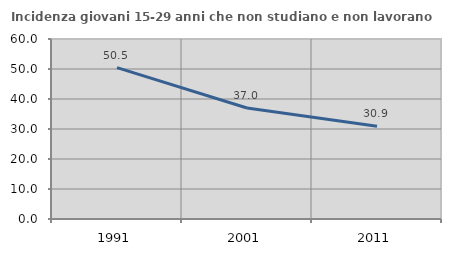
| Category | Incidenza giovani 15-29 anni che non studiano e non lavorano  |
|---|---|
| 1991.0 | 50.454 |
| 2001.0 | 36.986 |
| 2011.0 | 30.909 |